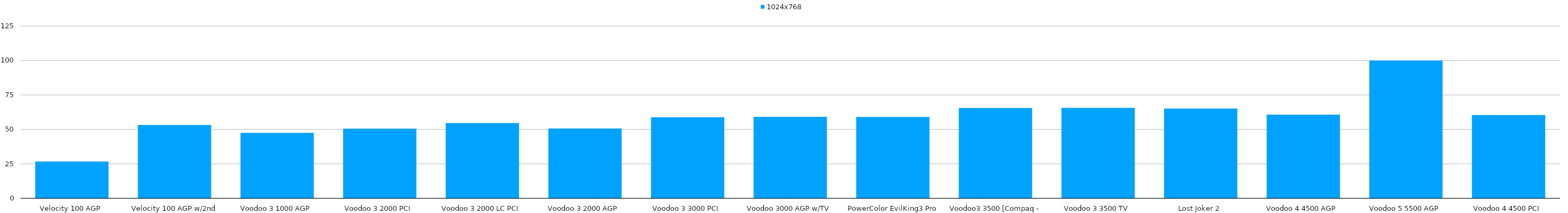
| Category | 1024x768 |
|---|---|
| Velocity 100 AGP | 26.683 |
| Velocity 100 AGP w/2nd TMU | 53.192 |
| Voodoo 3 1000 AGP | 47.486 |
| Voodoo 3 2000 PCI | 50.584 |
| Voodoo 3 2000 LC PCI | 54.643 |
| Voodoo 3 2000 AGP | 50.654 |
| Voodoo 3 3000 PCI | 58.879 |
| Voodoo 3000 AGP w/TV | 59.144 |
| PowerColor EvilKing3 Pro AGP  | 59.09 |
| Voodoo3 3500 [Compaq - no tuner] | 65.59 |
| Voodoo 3 3500 TV | 65.613 |
| Lost Joker 2 | 65.171 |
| Voodoo 4 4500 AGP | 60.735 |
| Voodoo 5 5500 AGP | 99.975 |
| Voodoo 4 4500 PCI | 60.468 |